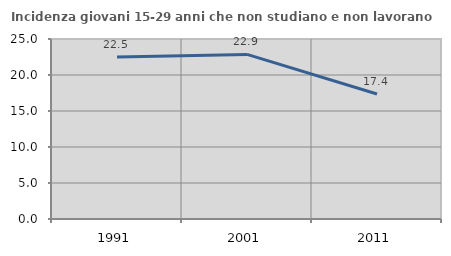
| Category | Incidenza giovani 15-29 anni che non studiano e non lavorano  |
|---|---|
| 1991.0 | 22.5 |
| 2001.0 | 22.86 |
| 2011.0 | 17.366 |